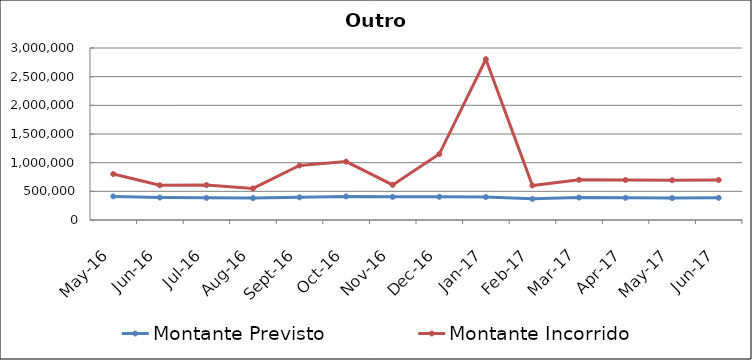
| Category | Montante Previsto | Montante Incorrido |
|---|---|---|
| 2016-05-01 | 411936.256 | 389520.48 |
| 2016-06-01 | 391622.161 | 214113.52 |
| 2016-07-01 | 386100.766 | 222621.77 |
| 2016-08-01 | 382569.57 | 168080.77 |
| 2016-09-01 | 395264.807 | 555354.61 |
| 2016-10-01 | 411455.069 | 607037.67 |
| 2016-11-01 | 403395.882 | 208461.72 |
| 2016-12-01 | 404756.262 | 744834.89 |
| 2017-01-01 | 401369.985 | 2402669.49 |
| 2017-02-01 | 368674.248 | 232974.89 |
| 2017-03-01 | 391600.165 | 309938.23 |
| 2017-04-01 | 387214.8 | 309938.23 |
| 2017-05-01 | 382496.404 | 309938.23 |
| 2017-06-01 | 387103.79 | 309938.23 |